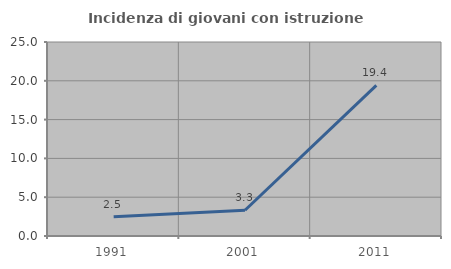
| Category | Incidenza di giovani con istruzione universitaria |
|---|---|
| 1991.0 | 2.488 |
| 2001.0 | 3.315 |
| 2011.0 | 19.403 |